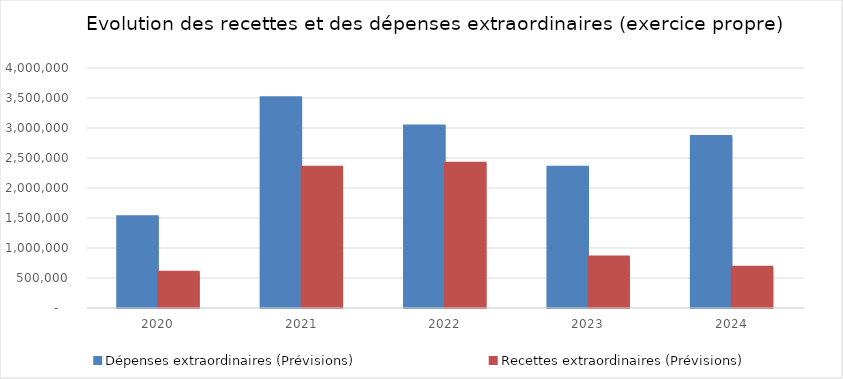
| Category | Dépenses extraordinaires (Prévisions) | Recettes extraordinaires (Prévisions) |
|---|---|---|
| 2020.0 | 1519757.53 | 595668.76 |
| 2021.0 | 3505023.3 | 2344055.26 |
| 2022.0 | 3034379.6 | 2413091.64 |
| 2023.0 | 2347658.3 | 850000 |
| 2024.0 | 2858964.88 | 680000 |